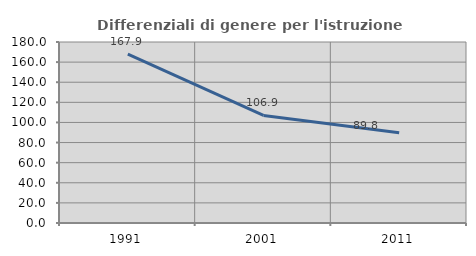
| Category | Differenziali di genere per l'istruzione superiore |
|---|---|
| 1991.0 | 167.902 |
| 2001.0 | 106.92 |
| 2011.0 | 89.822 |